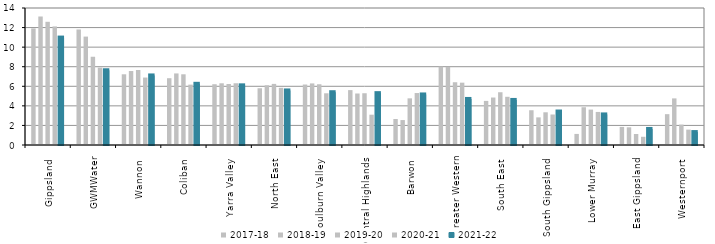
| Category | 2017-18 | 2018-19 | 2019-20 | 2020-21 | 2021-22 |
|---|---|---|---|---|---|
| Gippsland  | 11.915 | 13.119 | 12.589 | 12.118 | 10.978 |
| GWMWater | 11.806 | 11.079 | 9.018 | 7.905 | 7.637 |
| Wannon  | 7.225 | 7.558 | 7.664 | 6.893 | 7.108 |
| Coliban  | 6.826 | 7.313 | 7.226 | 6.168 | 6.254 |
| Yarra Valley  | 6.211 | 6.306 | 6.234 | 6.31 | 6.096 |
| North East  | 5.8 | 6.102 | 6.244 | 5.842 | 5.575 |
| Goulburn Valley  | 6.18 | 6.294 | 6.207 | 5.284 | 5.394 |
| Central Highlands  | 5.608 | 5.263 | 5.29 | 3.096 | 5.299 |
| Barwon  | 2.658 | 2.547 | 4.768 | 5.311 | 5.165 |
| Greater Western | 8.009 | 7.979 | 6.413 | 6.37 | 4.706 |
| South East  | 4.505 | 4.851 | 5.391 | 4.926 | 4.604 |
| South Gippsland  | 3.551 | 2.824 | 3.343 | 3.116 | 3.421 |
| Lower Murray  | 1.132 | 3.861 | 3.618 | 3.378 | 3.124 |
| East Gippsland  | 1.849 | 1.808 | 1.126 | 0.84 | 1.639 |
| Westernport  | 3.151 | 4.764 | 2.084 | 1.572 | 1.321 |